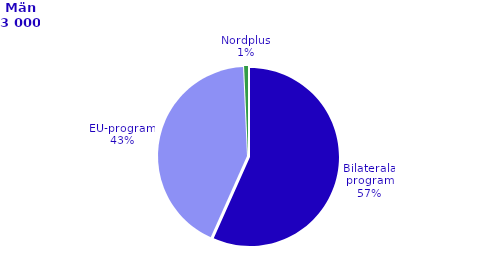
| Category | Series 0 |
|---|---|
| Bilaterala program | 1688 |
| EU-program | 1269 |
| Nordplus | 21 |